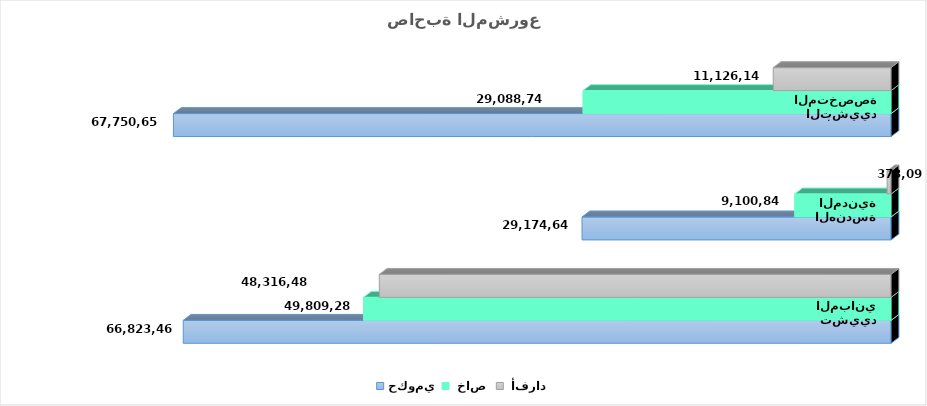
| Category | حكومي  |  خاص  |  أفراد  |
|---|---|---|---|
| تشييد المباني | 66823465.22 | 49809284.716 | 48316488.439 |
| الهندسة المدنية | 29174639.694 | 9100846.842 | 373092.471 |
| أنشطة التشييد المتخصصة | 67750654.771 | 29088748.112 | 11126149.022 |